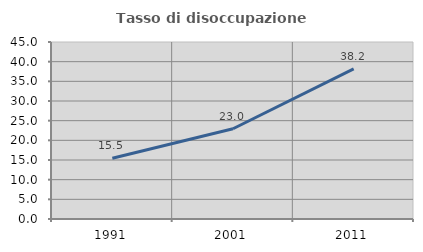
| Category | Tasso di disoccupazione giovanile  |
|---|---|
| 1991.0 | 15.455 |
| 2001.0 | 22.951 |
| 2011.0 | 38.182 |